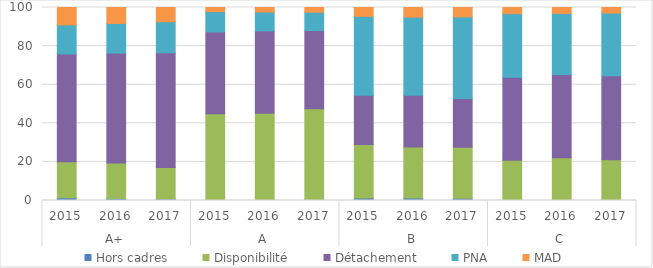
| Category | Hors cadres | Disponibilité | Détachement | PNA | MAD |
|---|---|---|---|---|---|
| 0 | 1.402 | 18.62 | 55.893 | 15.08 | 9.005 |
| 1 | 1.046 | 18.445 | 56.867 | 15.378 | 8.264 |
| 2 | 0.794 | 16.259 | 59.499 | 16.054 | 7.394 |
| 3 | 0.394 | 44.603 | 42.351 | 10.547 | 2.105 |
| 4 | 0.368 | 44.783 | 42.76 | 9.733 | 2.356 |
| 5 | 0.286 | 47.239 | 40.555 | 9.499 | 2.421 |
| 6 | 1.296 | 27.699 | 25.584 | 40.844 | 4.578 |
| 7 | 1.257 | 26.525 | 26.695 | 40.536 | 4.987 |
| 8 | 1.102 | 26.432 | 25.257 | 42.379 | 4.829 |
| 9 | 0.308 | 20.551 | 42.971 | 33.004 | 3.167 |
| 10 | 0.314 | 21.886 | 43.024 | 31.708 | 3.067 |
| 11 | 0.249 | 20.817 | 43.536 | 32.533 | 2.865 |